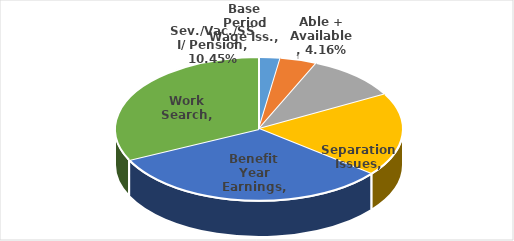
| Category | Series 0 |
|---|---|
| Base Period Wage Iss. | 0.024 |
| Able + Available | 0.042 |
| Sev./Vac./SSI/ Pension | 0.104 |
| Separation Issues | 0.188 |
| Benefit Year Earnings | 0.321 |
| Work Search | 0.321 |